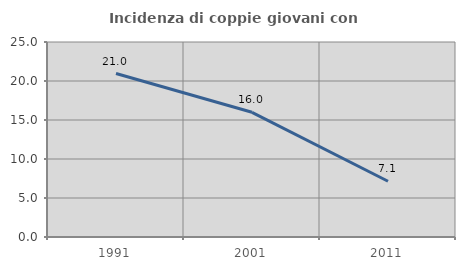
| Category | Incidenza di coppie giovani con figli |
|---|---|
| 1991.0 | 20.961 |
| 2001.0 | 15.986 |
| 2011.0 | 7.143 |